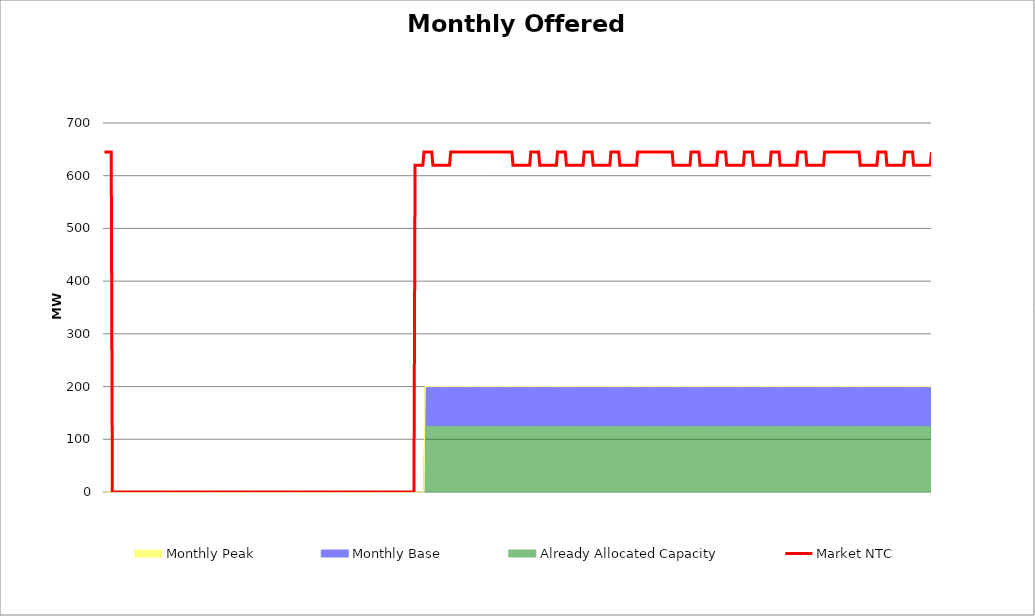
| Category | Market NTC |
|---|---|
| 0 | 645 |
| 1 | 645 |
| 2 | 645 |
| 3 | 645 |
| 4 | 645 |
| 5 | 645 |
| 6 | 645 |
| 7 | 0 |
| 8 | 0 |
| 9 | 0 |
| 10 | 0 |
| 11 | 0 |
| 12 | 0 |
| 13 | 0 |
| 14 | 0 |
| 15 | 0 |
| 16 | 0 |
| 17 | 0 |
| 18 | 0 |
| 19 | 0 |
| 20 | 0 |
| 21 | 0 |
| 22 | 0 |
| 23 | 0 |
| 24 | 0 |
| 25 | 0 |
| 26 | 0 |
| 27 | 0 |
| 28 | 0 |
| 29 | 0 |
| 30 | 0 |
| 31 | 0 |
| 32 | 0 |
| 33 | 0 |
| 34 | 0 |
| 35 | 0 |
| 36 | 0 |
| 37 | 0 |
| 38 | 0 |
| 39 | 0 |
| 40 | 0 |
| 41 | 0 |
| 42 | 0 |
| 43 | 0 |
| 44 | 0 |
| 45 | 0 |
| 46 | 0 |
| 47 | 0 |
| 48 | 0 |
| 49 | 0 |
| 50 | 0 |
| 51 | 0 |
| 52 | 0 |
| 53 | 0 |
| 54 | 0 |
| 55 | 0 |
| 56 | 0 |
| 57 | 0 |
| 58 | 0 |
| 59 | 0 |
| 60 | 0 |
| 61 | 0 |
| 62 | 0 |
| 63 | 0 |
| 64 | 0 |
| 65 | 0 |
| 66 | 0 |
| 67 | 0 |
| 68 | 0 |
| 69 | 0 |
| 70 | 0 |
| 71 | 0 |
| 72 | 0 |
| 73 | 0 |
| 74 | 0 |
| 75 | 0 |
| 76 | 0 |
| 77 | 0 |
| 78 | 0 |
| 79 | 0 |
| 80 | 0 |
| 81 | 0 |
| 82 | 0 |
| 83 | 0 |
| 84 | 0 |
| 85 | 0 |
| 86 | 0 |
| 87 | 0 |
| 88 | 0 |
| 89 | 0 |
| 90 | 0 |
| 91 | 0 |
| 92 | 0 |
| 93 | 0 |
| 94 | 0 |
| 95 | 0 |
| 96 | 0 |
| 97 | 0 |
| 98 | 0 |
| 99 | 0 |
| 100 | 0 |
| 101 | 0 |
| 102 | 0 |
| 103 | 0 |
| 104 | 0 |
| 105 | 0 |
| 106 | 0 |
| 107 | 0 |
| 108 | 0 |
| 109 | 0 |
| 110 | 0 |
| 111 | 0 |
| 112 | 0 |
| 113 | 0 |
| 114 | 0 |
| 115 | 0 |
| 116 | 0 |
| 117 | 0 |
| 118 | 0 |
| 119 | 0 |
| 120 | 0 |
| 121 | 0 |
| 122 | 0 |
| 123 | 0 |
| 124 | 0 |
| 125 | 0 |
| 126 | 0 |
| 127 | 0 |
| 128 | 0 |
| 129 | 0 |
| 130 | 0 |
| 131 | 0 |
| 132 | 0 |
| 133 | 0 |
| 134 | 0 |
| 135 | 0 |
| 136 | 0 |
| 137 | 0 |
| 138 | 0 |
| 139 | 0 |
| 140 | 0 |
| 141 | 0 |
| 142 | 0 |
| 143 | 0 |
| 144 | 0 |
| 145 | 0 |
| 146 | 0 |
| 147 | 0 |
| 148 | 0 |
| 149 | 0 |
| 150 | 0 |
| 151 | 0 |
| 152 | 0 |
| 153 | 0 |
| 154 | 0 |
| 155 | 0 |
| 156 | 0 |
| 157 | 0 |
| 158 | 0 |
| 159 | 0 |
| 160 | 0 |
| 161 | 0 |
| 162 | 0 |
| 163 | 0 |
| 164 | 0 |
| 165 | 0 |
| 166 | 0 |
| 167 | 0 |
| 168 | 0 |
| 169 | 0 |
| 170 | 0 |
| 171 | 0 |
| 172 | 0 |
| 173 | 0 |
| 174 | 0 |
| 175 | 0 |
| 176 | 0 |
| 177 | 0 |
| 178 | 0 |
| 179 | 0 |
| 180 | 0 |
| 181 | 0 |
| 182 | 0 |
| 183 | 0 |
| 184 | 0 |
| 185 | 0 |
| 186 | 0 |
| 187 | 0 |
| 188 | 0 |
| 189 | 0 |
| 190 | 0 |
| 191 | 0 |
| 192 | 0 |
| 193 | 0 |
| 194 | 0 |
| 195 | 0 |
| 196 | 0 |
| 197 | 0 |
| 198 | 0 |
| 199 | 0 |
| 200 | 0 |
| 201 | 0 |
| 202 | 0 |
| 203 | 0 |
| 204 | 0 |
| 205 | 0 |
| 206 | 0 |
| 207 | 0 |
| 208 | 0 |
| 209 | 0 |
| 210 | 0 |
| 211 | 0 |
| 212 | 0 |
| 213 | 0 |
| 214 | 0 |
| 215 | 0 |
| 216 | 0 |
| 217 | 0 |
| 218 | 0 |
| 219 | 0 |
| 220 | 0 |
| 221 | 0 |
| 222 | 0 |
| 223 | 0 |
| 224 | 0 |
| 225 | 0 |
| 226 | 0 |
| 227 | 0 |
| 228 | 0 |
| 229 | 0 |
| 230 | 0 |
| 231 | 0 |
| 232 | 0 |
| 233 | 0 |
| 234 | 0 |
| 235 | 0 |
| 236 | 0 |
| 237 | 0 |
| 238 | 0 |
| 239 | 0 |
| 240 | 0 |
| 241 | 0 |
| 242 | 0 |
| 243 | 0 |
| 244 | 0 |
| 245 | 0 |
| 246 | 0 |
| 247 | 0 |
| 248 | 0 |
| 249 | 0 |
| 250 | 0 |
| 251 | 0 |
| 252 | 0 |
| 253 | 0 |
| 254 | 0 |
| 255 | 0 |
| 256 | 0 |
| 257 | 0 |
| 258 | 0 |
| 259 | 0 |
| 260 | 0 |
| 261 | 0 |
| 262 | 0 |
| 263 | 0 |
| 264 | 0 |
| 265 | 0 |
| 266 | 0 |
| 267 | 0 |
| 268 | 0 |
| 269 | 0 |
| 270 | 0 |
| 271 | 0 |
| 272 | 0 |
| 273 | 0 |
| 274 | 0 |
| 275 | 0 |
| 276 | 0 |
| 277 | 0 |
| 278 | 0 |
| 279 | 620 |
| 280 | 620 |
| 281 | 620 |
| 282 | 620 |
| 283 | 620 |
| 284 | 620 |
| 285 | 620 |
| 286 | 620 |
| 287 | 645 |
| 288 | 645 |
| 289 | 645 |
| 290 | 645 |
| 291 | 645 |
| 292 | 645 |
| 293 | 645 |
| 294 | 645 |
| 295 | 620 |
| 296 | 620 |
| 297 | 620 |
| 298 | 620 |
| 299 | 620 |
| 300 | 620 |
| 301 | 620 |
| 302 | 620 |
| 303 | 620 |
| 304 | 620 |
| 305 | 620 |
| 306 | 620 |
| 307 | 620 |
| 308 | 620 |
| 309 | 620 |
| 310 | 620 |
| 311 | 645 |
| 312 | 645 |
| 313 | 645 |
| 314 | 645 |
| 315 | 645 |
| 316 | 645 |
| 317 | 645 |
| 318 | 645 |
| 319 | 645 |
| 320 | 645 |
| 321 | 645 |
| 322 | 645 |
| 323 | 645 |
| 324 | 645 |
| 325 | 645 |
| 326 | 645 |
| 327 | 645 |
| 328 | 645 |
| 329 | 645 |
| 330 | 645 |
| 331 | 645 |
| 332 | 645 |
| 333 | 645 |
| 334 | 645 |
| 335 | 645 |
| 336 | 645 |
| 337 | 645 |
| 338 | 645 |
| 339 | 645 |
| 340 | 645 |
| 341 | 645 |
| 342 | 645 |
| 343 | 645 |
| 344 | 645 |
| 345 | 645 |
| 346 | 645 |
| 347 | 645 |
| 348 | 645 |
| 349 | 645 |
| 350 | 645 |
| 351 | 645 |
| 352 | 645 |
| 353 | 645 |
| 354 | 645 |
| 355 | 645 |
| 356 | 645 |
| 357 | 645 |
| 358 | 645 |
| 359 | 645 |
| 360 | 645 |
| 361 | 645 |
| 362 | 645 |
| 363 | 645 |
| 364 | 645 |
| 365 | 645 |
| 366 | 645 |
| 367 | 620 |
| 368 | 620 |
| 369 | 620 |
| 370 | 620 |
| 371 | 620 |
| 372 | 620 |
| 373 | 620 |
| 374 | 620 |
| 375 | 620 |
| 376 | 620 |
| 377 | 620 |
| 378 | 620 |
| 379 | 620 |
| 380 | 620 |
| 381 | 620 |
| 382 | 620 |
| 383 | 645 |
| 384 | 645 |
| 385 | 645 |
| 386 | 645 |
| 387 | 645 |
| 388 | 645 |
| 389 | 645 |
| 390 | 645 |
| 391 | 620 |
| 392 | 620 |
| 393 | 620 |
| 394 | 620 |
| 395 | 620 |
| 396 | 620 |
| 397 | 620 |
| 398 | 620 |
| 399 | 620 |
| 400 | 620 |
| 401 | 620 |
| 402 | 620 |
| 403 | 620 |
| 404 | 620 |
| 405 | 620 |
| 406 | 620 |
| 407 | 645 |
| 408 | 645 |
| 409 | 645 |
| 410 | 645 |
| 411 | 645 |
| 412 | 645 |
| 413 | 645 |
| 414 | 645 |
| 415 | 620 |
| 416 | 620 |
| 417 | 620 |
| 418 | 620 |
| 419 | 620 |
| 420 | 620 |
| 421 | 620 |
| 422 | 620 |
| 423 | 620 |
| 424 | 620 |
| 425 | 620 |
| 426 | 620 |
| 427 | 620 |
| 428 | 620 |
| 429 | 620 |
| 430 | 620 |
| 431 | 645 |
| 432 | 645 |
| 433 | 645 |
| 434 | 645 |
| 435 | 645 |
| 436 | 645 |
| 437 | 645 |
| 438 | 645 |
| 439 | 620 |
| 440 | 620 |
| 441 | 620 |
| 442 | 620 |
| 443 | 620 |
| 444 | 620 |
| 445 | 620 |
| 446 | 620 |
| 447 | 620 |
| 448 | 620 |
| 449 | 620 |
| 450 | 620 |
| 451 | 620 |
| 452 | 620 |
| 453 | 620 |
| 454 | 620 |
| 455 | 645 |
| 456 | 645 |
| 457 | 645 |
| 458 | 645 |
| 459 | 645 |
| 460 | 645 |
| 461 | 645 |
| 462 | 645 |
| 463 | 620 |
| 464 | 620 |
| 465 | 620 |
| 466 | 620 |
| 467 | 620 |
| 468 | 620 |
| 469 | 620 |
| 470 | 620 |
| 471 | 620 |
| 472 | 620 |
| 473 | 620 |
| 474 | 620 |
| 475 | 620 |
| 476 | 620 |
| 477 | 620 |
| 478 | 620 |
| 479 | 645 |
| 480 | 645 |
| 481 | 645 |
| 482 | 645 |
| 483 | 645 |
| 484 | 645 |
| 485 | 645 |
| 486 | 645 |
| 487 | 645 |
| 488 | 645 |
| 489 | 645 |
| 490 | 645 |
| 491 | 645 |
| 492 | 645 |
| 493 | 645 |
| 494 | 645 |
| 495 | 645 |
| 496 | 645 |
| 497 | 645 |
| 498 | 645 |
| 499 | 645 |
| 500 | 645 |
| 501 | 645 |
| 502 | 645 |
| 503 | 645 |
| 504 | 645 |
| 505 | 645 |
| 506 | 645 |
| 507 | 645 |
| 508 | 645 |
| 509 | 645 |
| 510 | 645 |
| 511 | 620 |
| 512 | 620 |
| 513 | 620 |
| 514 | 620 |
| 515 | 620 |
| 516 | 620 |
| 517 | 620 |
| 518 | 620 |
| 519 | 620 |
| 520 | 620 |
| 521 | 620 |
| 522 | 620 |
| 523 | 620 |
| 524 | 620 |
| 525 | 620 |
| 526 | 620 |
| 527 | 645 |
| 528 | 645 |
| 529 | 645 |
| 530 | 645 |
| 531 | 645 |
| 532 | 645 |
| 533 | 645 |
| 534 | 645 |
| 535 | 620 |
| 536 | 620 |
| 537 | 620 |
| 538 | 620 |
| 539 | 620 |
| 540 | 620 |
| 541 | 620 |
| 542 | 620 |
| 543 | 620 |
| 544 | 620 |
| 545 | 620 |
| 546 | 620 |
| 547 | 620 |
| 548 | 620 |
| 549 | 620 |
| 550 | 620 |
| 551 | 645 |
| 552 | 645 |
| 553 | 645 |
| 554 | 645 |
| 555 | 645 |
| 556 | 645 |
| 557 | 645 |
| 558 | 645 |
| 559 | 620 |
| 560 | 620 |
| 561 | 620 |
| 562 | 620 |
| 563 | 620 |
| 564 | 620 |
| 565 | 620 |
| 566 | 620 |
| 567 | 620 |
| 568 | 620 |
| 569 | 620 |
| 570 | 620 |
| 571 | 620 |
| 572 | 620 |
| 573 | 620 |
| 574 | 620 |
| 575 | 645 |
| 576 | 645 |
| 577 | 645 |
| 578 | 645 |
| 579 | 645 |
| 580 | 645 |
| 581 | 645 |
| 582 | 645 |
| 583 | 620 |
| 584 | 620 |
| 585 | 620 |
| 586 | 620 |
| 587 | 620 |
| 588 | 620 |
| 589 | 620 |
| 590 | 620 |
| 591 | 620 |
| 592 | 620 |
| 593 | 620 |
| 594 | 620 |
| 595 | 620 |
| 596 | 620 |
| 597 | 620 |
| 598 | 620 |
| 599 | 645 |
| 600 | 645 |
| 601 | 645 |
| 602 | 645 |
| 603 | 645 |
| 604 | 645 |
| 605 | 645 |
| 606 | 645 |
| 607 | 620 |
| 608 | 620 |
| 609 | 620 |
| 610 | 620 |
| 611 | 620 |
| 612 | 620 |
| 613 | 620 |
| 614 | 620 |
| 615 | 620 |
| 616 | 620 |
| 617 | 620 |
| 618 | 620 |
| 619 | 620 |
| 620 | 620 |
| 621 | 620 |
| 622 | 620 |
| 623 | 645 |
| 624 | 645 |
| 625 | 645 |
| 626 | 645 |
| 627 | 645 |
| 628 | 645 |
| 629 | 645 |
| 630 | 645 |
| 631 | 620 |
| 632 | 620 |
| 633 | 620 |
| 634 | 620 |
| 635 | 620 |
| 636 | 620 |
| 637 | 620 |
| 638 | 620 |
| 639 | 620 |
| 640 | 620 |
| 641 | 620 |
| 642 | 620 |
| 643 | 620 |
| 644 | 620 |
| 645 | 620 |
| 646 | 620 |
| 647 | 645 |
| 648 | 645 |
| 649 | 645 |
| 650 | 645 |
| 651 | 645 |
| 652 | 645 |
| 653 | 645 |
| 654 | 645 |
| 655 | 645 |
| 656 | 645 |
| 657 | 645 |
| 658 | 645 |
| 659 | 645 |
| 660 | 645 |
| 661 | 645 |
| 662 | 645 |
| 663 | 645 |
| 664 | 645 |
| 665 | 645 |
| 666 | 645 |
| 667 | 645 |
| 668 | 645 |
| 669 | 645 |
| 670 | 645 |
| 671 | 645 |
| 672 | 645 |
| 673 | 645 |
| 674 | 645 |
| 675 | 645 |
| 676 | 645 |
| 677 | 645 |
| 678 | 645 |
| 679 | 620 |
| 680 | 620 |
| 681 | 620 |
| 682 | 620 |
| 683 | 620 |
| 684 | 620 |
| 685 | 620 |
| 686 | 620 |
| 687 | 620 |
| 688 | 620 |
| 689 | 620 |
| 690 | 620 |
| 691 | 620 |
| 692 | 620 |
| 693 | 620 |
| 694 | 620 |
| 695 | 645 |
| 696 | 645 |
| 697 | 645 |
| 698 | 645 |
| 699 | 645 |
| 700 | 645 |
| 701 | 645 |
| 702 | 645 |
| 703 | 620 |
| 704 | 620 |
| 705 | 620 |
| 706 | 620 |
| 707 | 620 |
| 708 | 620 |
| 709 | 620 |
| 710 | 620 |
| 711 | 620 |
| 712 | 620 |
| 713 | 620 |
| 714 | 620 |
| 715 | 620 |
| 716 | 620 |
| 717 | 620 |
| 718 | 620 |
| 719 | 645 |
| 720 | 645 |
| 721 | 645 |
| 722 | 645 |
| 723 | 645 |
| 724 | 645 |
| 725 | 645 |
| 726 | 645 |
| 727 | 620 |
| 728 | 620 |
| 729 | 620 |
| 730 | 620 |
| 731 | 620 |
| 732 | 620 |
| 733 | 620 |
| 734 | 620 |
| 735 | 620 |
| 736 | 620 |
| 737 | 620 |
| 738 | 620 |
| 739 | 620 |
| 740 | 620 |
| 741 | 620 |
| 742 | 620 |
| 743 | 645 |